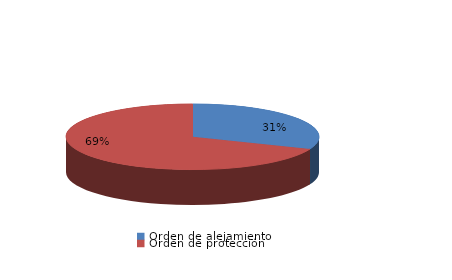
| Category | Series 0 |
|---|---|
| Orden de alejamiento | 9 |
| Orden de protección | 20 |